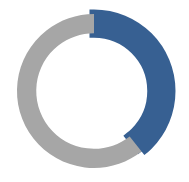
| Category | Series 0 |
|---|---|
| 0 | 0.394 |
| 1 | 0.606 |